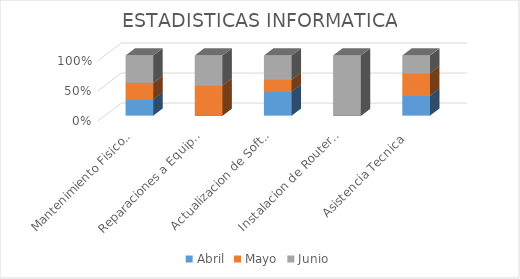
| Category | Abril | Mayo | Junio |
|---|---|---|---|
| Mantenimiento Fisico y Logico | 6 | 6 | 10 |
| Reparaciones a Equipos  | 0 | 1 | 1 |
| Actualizacion de Software | 4 | 2 | 4 |
| Instalacion de Router Inalambrico | 0 | 0 | 1 |
| Asistencia Tecnica | 9 | 10 | 8 |